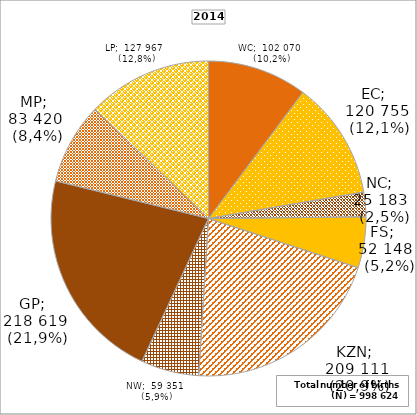
| Category | Series 0 | Series 1 |
|---|---|---|
| WC | 102070 | 10.221 |
| EC | 120755 | 12.092 |
| NC | 25183 | 2.522 |
| FS | 52148 | 5.222 |
| KZN | 209111 | 20.94 |
| NW | 59351 | 5.943 |
| GP | 218619 | 21.892 |
| MP | 83420 | 8.353 |
| LP | 127967 | 12.814 |